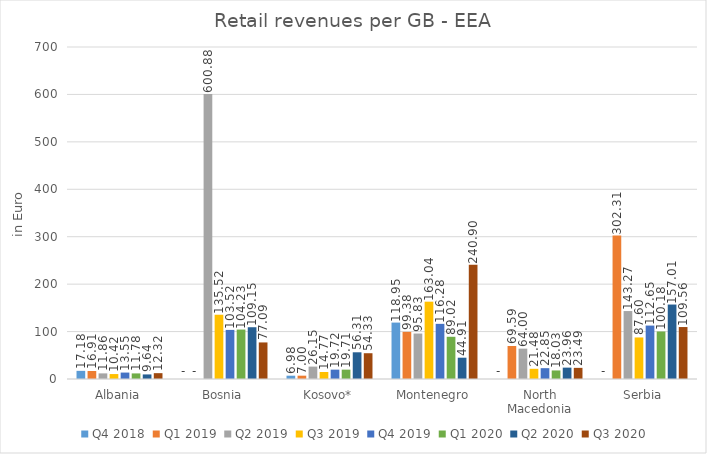
| Category | Q4 2018 | Q1 2019 | Q2 2019 | Q3 2019 | Q4 2019 | Q1 2020 | Q2 2020 | Q3 2020 |
|---|---|---|---|---|---|---|---|---|
| Albania | 17.178 | 16.905 | 11.865 | 10.424 | 13.553 | 11.783 | 9.642 | 12.315 |
| Bosnia | 0 | 0 | 600.885 | 135.515 | 103.52 | 104.232 | 109.151 | 77.09 |
| Kosovo* | 6.982 | 7.001 | 26.146 | 14.771 | 19.72 | 19.707 | 56.312 | 54.333 |
| Montenegro | 118.947 | 99.382 | 95.828 | 163.045 | 116.276 | 89.017 | 44.906 | 240.9 |
| North Macedonia | 0 | 69.586 | 63.996 | 21.484 | 22.845 | 18.034 | 23.963 | 23.491 |
| Serbia | 0 | 302.31 | 143.272 | 87.603 | 112.654 | 100.177 | 157.007 | 109.558 |